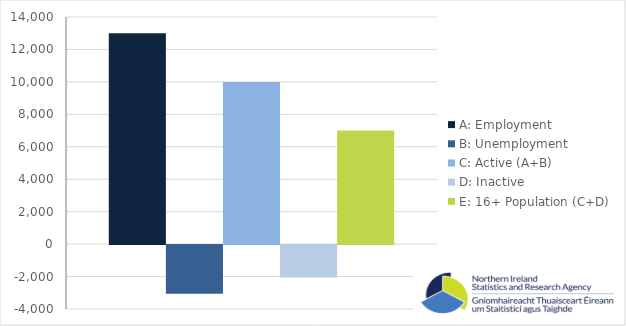
| Category | A: Employment | B: Unemployment | C: Active (A+B) | D: Inactive | E: 16+ Population (C+D) |
|---|---|---|---|---|---|
| 0 | 13000 | -3000 | 10000 | -2000 | 7000 |